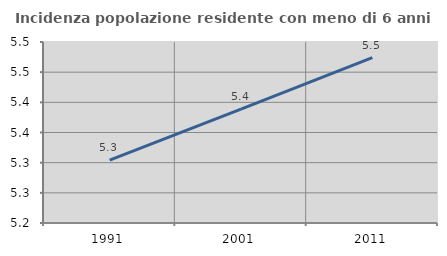
| Category | Incidenza popolazione residente con meno di 6 anni |
|---|---|
| 1991.0 | 5.304 |
| 2001.0 | 5.389 |
| 2011.0 | 5.474 |